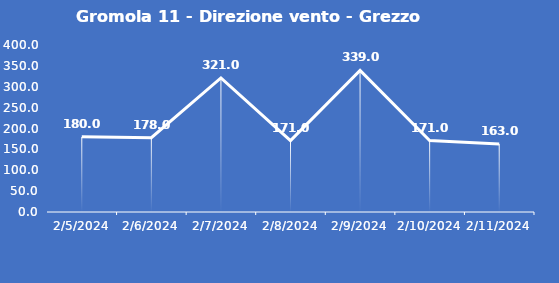
| Category | Gromola 11 - Direzione vento - Grezzo (°N) |
|---|---|
| 2/5/24 | 180 |
| 2/6/24 | 178 |
| 2/7/24 | 321 |
| 2/8/24 | 171 |
| 2/9/24 | 339 |
| 2/10/24 | 171 |
| 2/11/24 | 163 |